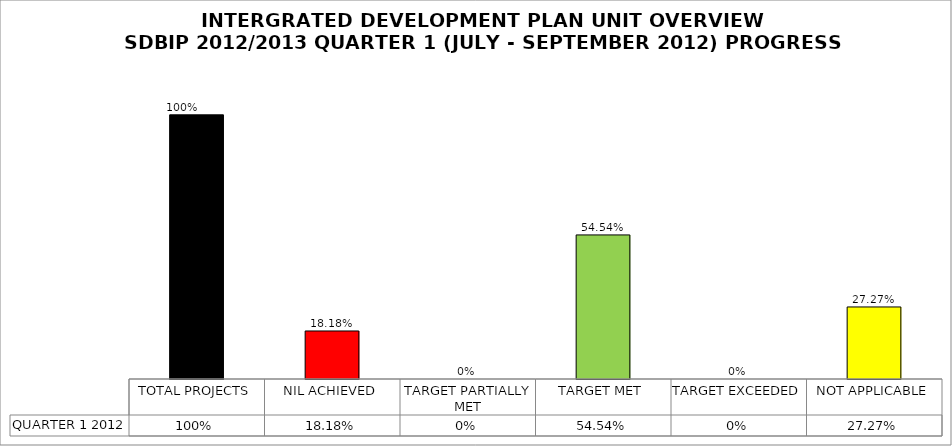
| Category | QUARTER 1 2012 |
|---|---|
| TOTAL PROJECTS | 1 |
| NIL ACHIEVED | 0.182 |
| TARGET PARTIALLY MET | 0 |
| TARGET MET | 0.545 |
| TARGET EXCEEDED | 0 |
| NOT APPLICABLE | 0.273 |